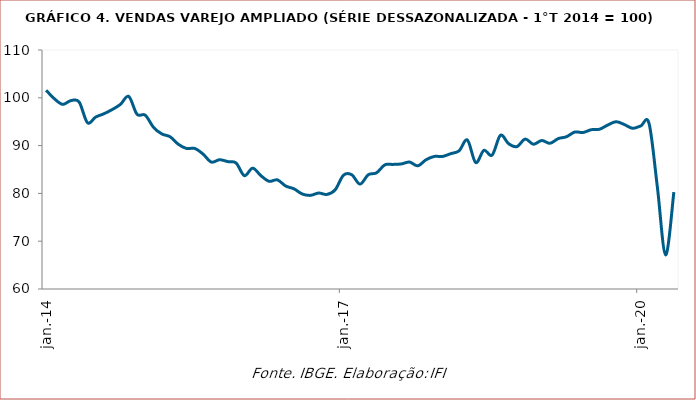
| Category | PMC |
|---|---|
| 2014-01-01 | 101.57 |
| 2014-02-01 | 99.804 |
| 2014-03-01 | 98.626 |
| 2014-04-01 | 99.411 |
| 2014-05-01 | 99.117 |
| 2014-06-01 | 94.799 |
| 2014-07-01 | 95.976 |
| 2014-08-01 | 96.663 |
| 2014-09-01 | 97.547 |
| 2014-10-01 | 98.626 |
| 2014-11-01 | 100.294 |
| 2014-12-01 | 96.565 |
| 2015-01-01 | 96.369 |
| 2015-02-01 | 93.817 |
| 2015-03-01 | 92.444 |
| 2015-04-01 | 91.855 |
| 2015-05-01 | 90.285 |
| 2015-06-01 | 89.401 |
| 2015-07-01 | 89.401 |
| 2015-08-01 | 88.224 |
| 2015-09-01 | 86.555 |
| 2015-10-01 | 87.046 |
| 2015-11-01 | 86.654 |
| 2015-12-01 | 86.359 |
| 2016-01-01 | 83.71 |
| 2016-02-01 | 85.28 |
| 2016-03-01 | 83.71 |
| 2016-04-01 | 82.532 |
| 2016-05-01 | 82.826 |
| 2016-06-01 | 81.551 |
| 2016-07-01 | 80.962 |
| 2016-08-01 | 79.882 |
| 2016-09-01 | 79.588 |
| 2016-10-01 | 80.079 |
| 2016-11-01 | 79.784 |
| 2016-12-01 | 80.765 |
| 2017-01-01 | 83.808 |
| 2017-02-01 | 83.906 |
| 2017-03-01 | 81.943 |
| 2017-04-01 | 83.906 |
| 2017-05-01 | 84.298 |
| 2017-06-01 | 85.967 |
| 2017-07-01 | 86.065 |
| 2017-08-01 | 86.163 |
| 2017-09-01 | 86.555 |
| 2017-10-01 | 85.77 |
| 2017-11-01 | 87.046 |
| 2017-12-01 | 87.733 |
| 2018-01-01 | 87.733 |
| 2018-02-01 | 88.322 |
| 2018-03-01 | 88.911 |
| 2018-04-01 | 91.168 |
| 2018-05-01 | 86.457 |
| 2018-06-01 | 89.009 |
| 2018-07-01 | 88.027 |
| 2018-08-01 | 92.149 |
| 2018-09-01 | 90.383 |
| 2018-10-01 | 89.794 |
| 2018-11-01 | 91.364 |
| 2018-12-01 | 90.285 |
| 2019-01-01 | 91.07 |
| 2019-02-01 | 90.481 |
| 2019-03-01 | 91.462 |
| 2019-04-01 | 91.855 |
| 2019-05-01 | 92.836 |
| 2019-06-01 | 92.738 |
| 2019-07-01 | 93.327 |
| 2019-08-01 | 93.425 |
| 2019-09-01 | 94.308 |
| 2019-10-01 | 94.995 |
| 2019-11-01 | 94.406 |
| 2019-12-01 | 93.621 |
| 2020-01-01 | 94.112 |
| 2020-02-01 | 94.603 |
| 2020-03-01 | 81.354 |
| 2020-04-01 | 67.125 |
| 2020-05-01 | 80.275 |